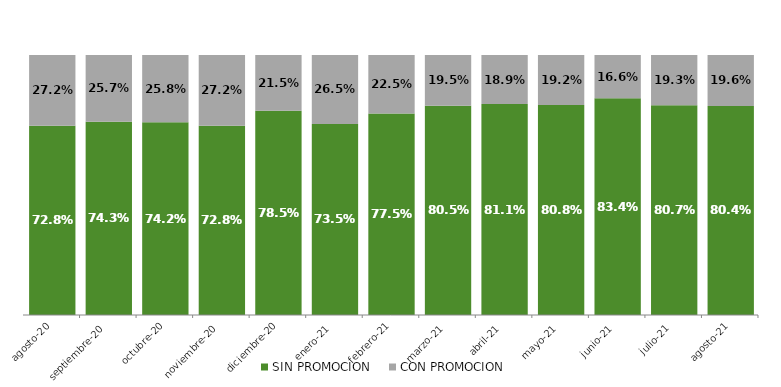
| Category | SIN PROMOCION   | CON PROMOCION   |
|---|---|---|
| 2020-08-01 | 0.728 | 0.272 |
| 2020-09-01 | 0.743 | 0.257 |
| 2020-10-01 | 0.742 | 0.258 |
| 2020-11-01 | 0.728 | 0.272 |
| 2020-12-01 | 0.785 | 0.215 |
| 2021-01-01 | 0.735 | 0.265 |
| 2021-02-01 | 0.775 | 0.225 |
| 2021-03-01 | 0.805 | 0.195 |
| 2021-04-01 | 0.811 | 0.189 |
| 2021-05-01 | 0.808 | 0.192 |
| 2021-06-01 | 0.834 | 0.166 |
| 2021-07-01 | 0.807 | 0.193 |
| 2021-08-01 | 0.804 | 0.196 |